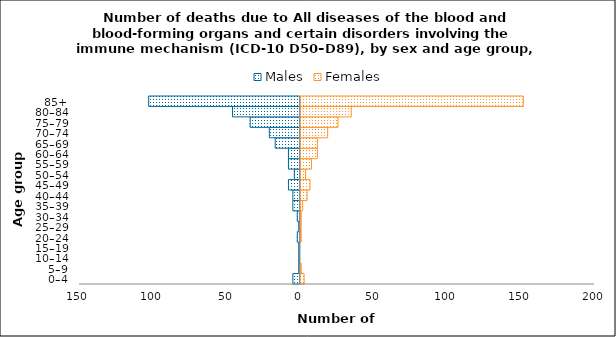
| Category | Males | Females |
|---|---|---|
| 0–4 | -5 | 3 |
| 5–9 | -1 | 1 |
| 10–14 | -1 | 0 |
| 15–19 | -1 | 0 |
| 20–24 | -2 | 1 |
| 25–29 | -1 | 1 |
| 30–34 | -2 | 1 |
| 35–39 | -5 | 2 |
| 40–44 | -5 | 5 |
| 45–49 | -8 | 7 |
| 50–54 | -4 | 4 |
| 55–59 | -8 | 8 |
| 60–64 | -8 | 12 |
| 65–69 | -17 | 12 |
| 70–74 | -21 | 19 |
| 75–79 | -34 | 26 |
| 80–84 | -46 | 35 |
| 85+ | -103 | 152 |